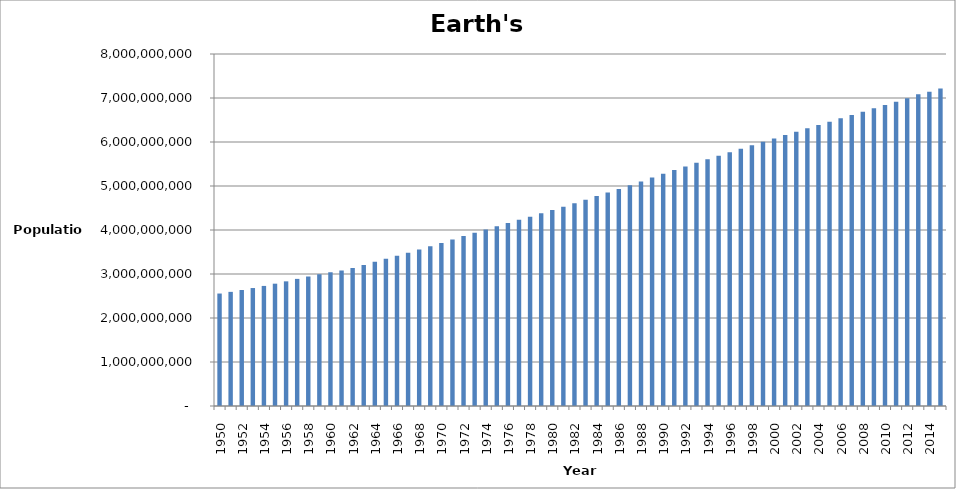
| Category | Series 0 |
|---|---|
| 1950.0 | 2556000000 |
| 1951.0 | 2594000000 |
| 1952.0 | 2636000000 |
| 1953.0 | 2681000000 |
| 1954.0 | 2729000000 |
| 1955.0 | 2780000000 |
| 1956.0 | 2833000000 |
| 1957.0 | 2889000000 |
| 1958.0 | 2945000000 |
| 1959.0 | 2997000000 |
| 1960.0 | 3039000000 |
| 1961.0 | 3080000000 |
| 1962.0 | 3136000000 |
| 1963.0 | 3205000000 |
| 1964.0 | 3276000000 |
| 1965.0 | 3345000000 |
| 1966.0 | 3416000000 |
| 1967.0 | 3485000000 |
| 1968.0 | 3557000000 |
| 1969.0 | 3631000000 |
| 1970.0 | 3707000000 |
| 1971.0 | 3784000000 |
| 1972.0 | 3861000000 |
| 1973.0 | 3937000000 |
| 1974.0 | 4013000000 |
| 1975.0 | 4086000000 |
| 1976.0 | 4158000000 |
| 1977.0 | 4231000000 |
| 1978.0 | 4303000000 |
| 1979.0 | 4378000000 |
| 1980.0 | 4454000000 |
| 1981.0 | 4530000000 |
| 1982.0 | 4610000000 |
| 1983.0 | 4690000000 |
| 1984.0 | 4770000000 |
| 1985.0 | 4850000000 |
| 1986.0 | 4933000000 |
| 1987.0 | 5018000000 |
| 1988.0 | 5105000000 |
| 1989.0 | 5191000000 |
| 1990.0 | 5278000000 |
| 1991.0 | 5361000000 |
| 1992.0 | 5444000000 |
| 1993.0 | 5526000000 |
| 1994.0 | 5606000000 |
| 1995.0 | 5687000000 |
| 1996.0 | 5766000000 |
| 1997.0 | 5847000000 |
| 1998.0 | 5926000000 |
| 1999.0 | 6004000000 |
| 2000.0 | 6081000000 |
| 2001.0 | 6158000000 |
| 2002.0 | 6234000000 |
| 2003.0 | 6311000000 |
| 2004.0 | 6387000000 |
| 2005.0 | 6462000000 |
| 2006.0 | 6538000000 |
| 2007.0 | 6613000000 |
| 2008.0 | 6689000000 |
| 2009.0 | 6765000000 |
| 2010.0 | 6840000000 |
| 2011.0 | 6916000000 |
| 2012.0 | 6992000000 |
| 2013.0 | 7086000000 |
| 2014.0 | 7141000000 |
| 2015.0 | 7215000000 |